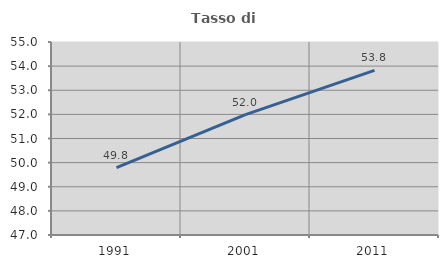
| Category | Tasso di occupazione   |
|---|---|
| 1991.0 | 49.789 |
| 2001.0 | 51.993 |
| 2011.0 | 53.823 |